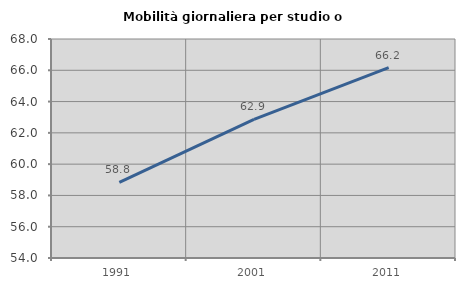
| Category | Mobilità giornaliera per studio o lavoro |
|---|---|
| 1991.0 | 58.829 |
| 2001.0 | 62.868 |
| 2011.0 | 66.174 |